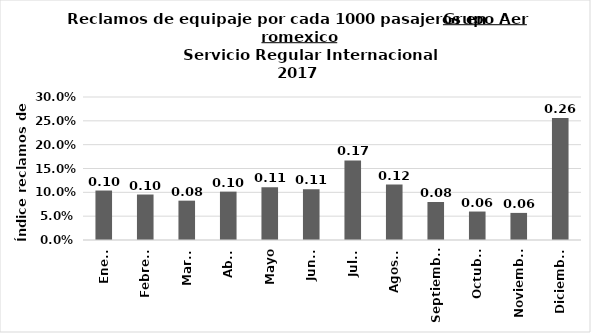
| Category | Reclamos por cada 1000 pasajeros |
|---|---|
| Enero | 0.104 |
| Febrero | 0.095 |
| Marzo | 0.083 |
| Abril | 0.101 |
| Mayo | 0.111 |
| Junio | 0.106 |
| Julio | 0.167 |
| Agosto | 0.116 |
| Septiembre | 0.08 |
| Octubre | 0.06 |
| Noviembre | 0.057 |
| Diciembre | 0.256 |